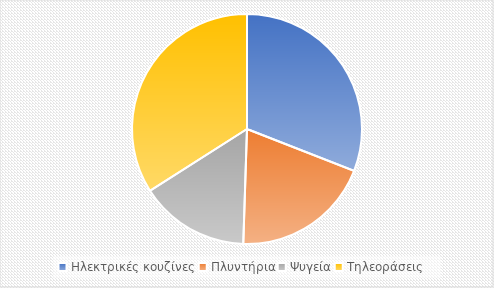
| Category | Series 0 |
|---|---|
| Ηλεκτρικές κουζίνες | 15600 |
| Πλυντήρια | 9880 |
| Ψυγεία | 7800 |
| Τηλεοράσεις | 17160 |